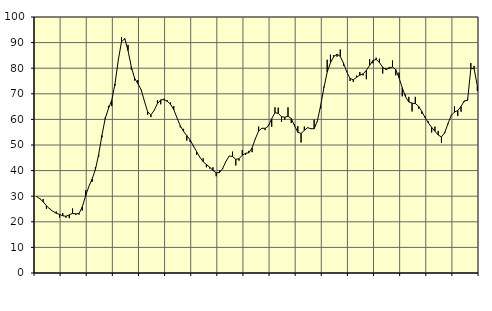
| Category | Piggar | Series 1 |
|---|---|---|
| nan | 30 | 29.84 |
| 87.0 | 28.9 | 29.01 |
| 87.0 | 28.9 | 27.8 |
| 87.0 | 25 | 26.3 |
| nan | 25.2 | 24.99 |
| 88.0 | 24.1 | 24.09 |
| 88.0 | 24 | 23.32 |
| 88.0 | 21.7 | 22.88 |
| nan | 23.4 | 22.35 |
| 89.0 | 21.6 | 22.17 |
| 89.0 | 21.4 | 22.69 |
| 89.0 | 25.2 | 23.29 |
| nan | 22.7 | 23.09 |
| 90.0 | 22.8 | 23.25 |
| 90.0 | 24.4 | 25.9 |
| 90.0 | 32.4 | 30.11 |
| nan | 33.8 | 33.82 |
| 91.0 | 35.6 | 36.71 |
| 91.0 | 41.3 | 40.41 |
| 91.0 | 45.4 | 46.29 |
| nan | 52.9 | 53.74 |
| 92.0 | 60.7 | 60.31 |
| 92.0 | 65.3 | 64.28 |
| 92.0 | 65.2 | 67.43 |
| nan | 73.2 | 73.88 |
| 93.0 | 83.2 | 83.12 |
| 93.0 | 92.1 | 90.35 |
| 93.0 | 91.2 | 91.53 |
| nan | 89.1 | 86.88 |
| 94.0 | 79.4 | 80.57 |
| 94.0 | 75.2 | 76.08 |
| 94.0 | 75.4 | 73.99 |
| nan | 71.5 | 71.62 |
| 95.0 | 67.3 | 67.22 |
| 95.0 | 61.8 | 62.99 |
| 95.0 | 60.9 | 61.74 |
| nan | 63.6 | 63.52 |
| 96.0 | 67.5 | 66.15 |
| 96.0 | 65.9 | 67.64 |
| 96.0 | 68.1 | 67.71 |
| nan | 67.5 | 67.07 |
| 97.0 | 66.6 | 65.94 |
| 97.0 | 65.2 | 63.81 |
| 97.0 | 60.6 | 60.58 |
| nan | 56.9 | 57.49 |
| 98.0 | 56.3 | 55.32 |
| 98.0 | 51.7 | 53.69 |
| 98.0 | 51.2 | 52 |
| nan | 49.5 | 49.69 |
| 99.0 | 46.2 | 47.39 |
| 99.0 | 45.3 | 45.21 |
| 99.0 | 44.8 | 43.49 |
| nan | 41.3 | 42.4 |
| 0.0 | 40.8 | 41.31 |
| 0.0 | 41.3 | 40.1 |
| 0.0 | 37.8 | 39.11 |
| nan | 40.1 | 39.2 |
| 1.0 | 40.6 | 40.89 |
| 1.0 | 43.6 | 43.66 |
| 1.0 | 45.7 | 45.72 |
| nan | 47.4 | 45.52 |
| 2.0 | 42 | 44.42 |
| 2.0 | 43.9 | 44.65 |
| 2.0 | 48 | 45.99 |
| nan | 46.1 | 46.77 |
| 3.0 | 47.7 | 46.96 |
| 3.0 | 47.2 | 48.87 |
| 3.0 | 52.3 | 52.47 |
| nan | 57.2 | 55.46 |
| 4.0 | 56.4 | 56.57 |
| 4.0 | 55.8 | 56.49 |
| 4.0 | 57.9 | 57.4 |
| nan | 57.1 | 60.26 |
| 5.0 | 64.7 | 62.62 |
| 5.0 | 64.6 | 62.36 |
| 5.0 | 59 | 61.07 |
| nan | 59.9 | 60.83 |
| 6.0 | 64.7 | 61.23 |
| 6.0 | 58.6 | 60.33 |
| 6.0 | 58 | 57.54 |
| nan | 57.4 | 54.97 |
| 7.0 | 51 | 54.52 |
| 7.0 | 57.2 | 55.76 |
| 7.0 | 56.6 | 56.78 |
| nan | 56.5 | 56.36 |
| 8.0 | 59.9 | 56.33 |
| 8.0 | 59.2 | 59.41 |
| 8.0 | 64.3 | 65.45 |
| nan | 72.8 | 72.41 |
| 9.0 | 83.3 | 78.47 |
| 9.0 | 85.3 | 82.15 |
| 9.0 | 85.1 | 84.51 |
| nan | 84.5 | 85.51 |
| 10.0 | 87.3 | 84.6 |
| 10.0 | 81 | 81.98 |
| 10.0 | 78.8 | 78.52 |
| nan | 75 | 76.01 |
| 11.0 | 74.6 | 75.48 |
| 11.0 | 77.1 | 76.45 |
| 11.0 | 78.5 | 77.27 |
| nan | 77.2 | 77.82 |
| 12.0 | 75.7 | 79.16 |
| 12.0 | 83.5 | 81.11 |
| 12.0 | 81.9 | 82.97 |
| nan | 84.1 | 83.42 |
| 13.0 | 83.7 | 82.24 |
| 13.0 | 77.9 | 80.32 |
| 13.0 | 80 | 79.5 |
| nan | 80.5 | 79.99 |
| 14.0 | 83 | 80.46 |
| 14.0 | 77.2 | 79.44 |
| 14.0 | 78.3 | 76.29 |
| nan | 69 | 72.35 |
| 15.0 | 69.7 | 68.81 |
| 15.0 | 68.8 | 66.79 |
| 15.0 | 63.1 | 66.34 |
| nan | 68.8 | 66.19 |
| 16.0 | 64.2 | 65.16 |
| 16.0 | 62.2 | 63.05 |
| 16.0 | 61.2 | 60.68 |
| nan | 59.2 | 58.63 |
| 17.0 | 54.9 | 56.9 |
| 17.0 | 57.2 | 55.38 |
| 17.0 | 55.5 | 53.89 |
| nan | 50.8 | 53.17 |
| 18.0 | 55.1 | 54.77 |
| 18.0 | 58.1 | 58.37 |
| 18.0 | 61.8 | 61.57 |
| nan | 65.1 | 62.86 |
| 19.0 | 61.3 | 63.49 |
| 19.0 | 63 | 65.04 |
| 19.0 | 66.8 | 67.22 |
| nan | 68 | 67.46 |
| 20.0 | 82 | 79.83 |
| 20.0 | 80.9 | 79.84 |
| 20.0 | 71.1 | 72.96 |